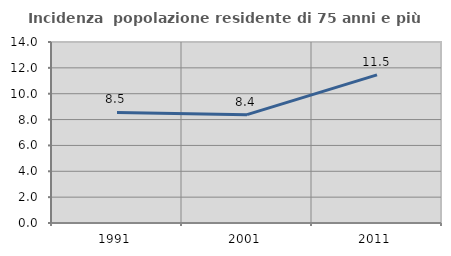
| Category | Incidenza  popolazione residente di 75 anni e più |
|---|---|
| 1991.0 | 8.547 |
| 2001.0 | 8.381 |
| 2011.0 | 11.462 |